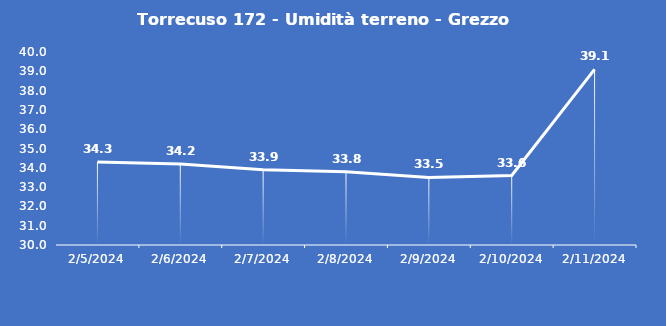
| Category | Torrecuso 172 - Umidità terreno - Grezzo (%VWC) |
|---|---|
| 2/5/24 | 34.3 |
| 2/6/24 | 34.2 |
| 2/7/24 | 33.9 |
| 2/8/24 | 33.8 |
| 2/9/24 | 33.5 |
| 2/10/24 | 33.6 |
| 2/11/24 | 39.1 |